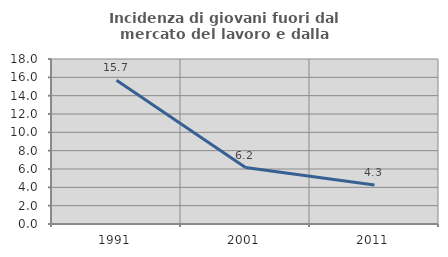
| Category | Incidenza di giovani fuori dal mercato del lavoro e dalla formazione  |
|---|---|
| 1991.0 | 15.686 |
| 2001.0 | 6.154 |
| 2011.0 | 4.255 |